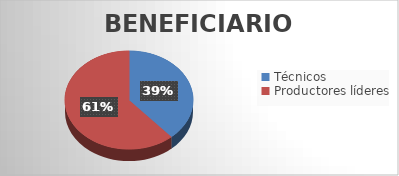
| Category | Series 0 |
|---|---|
| Técnicos | 109 |
| Productores líderes | 174 |